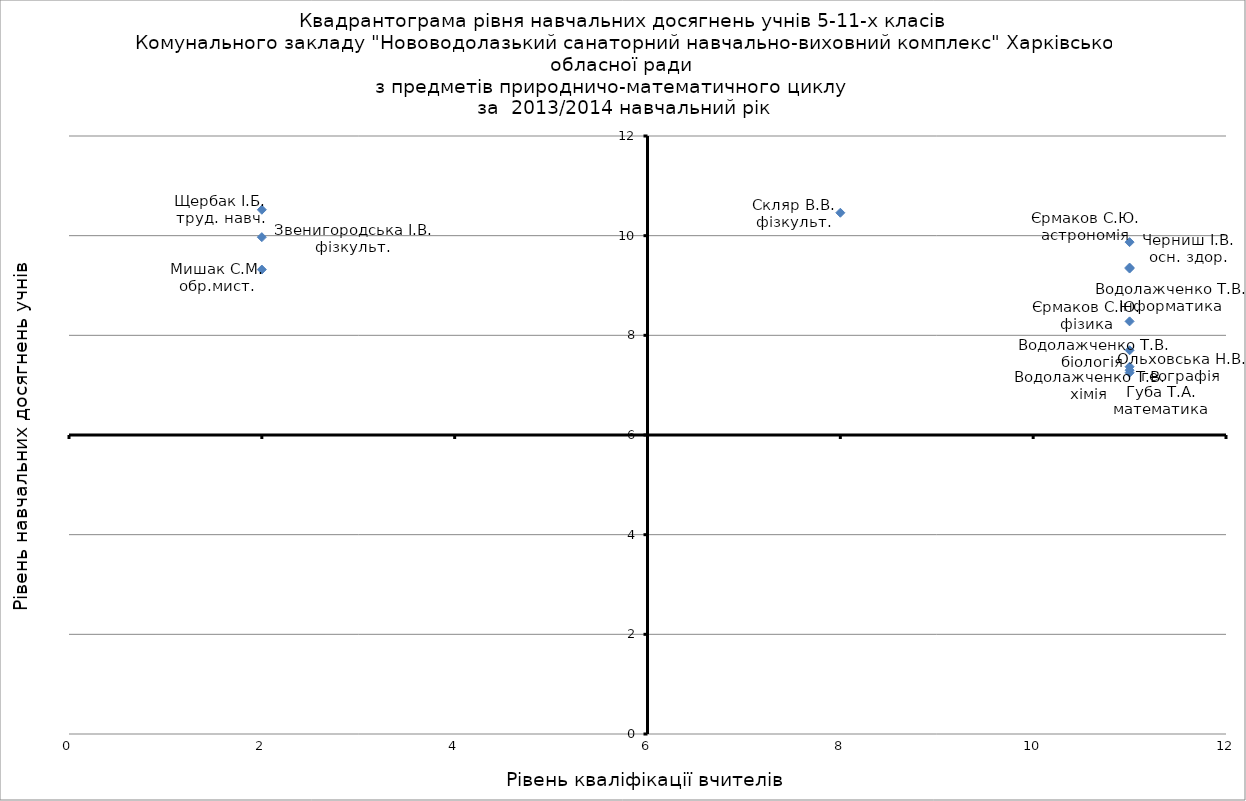
| Category | Series 0 |
|---|---|
| 11.0 | 8.28 |
| 11.0 | 7.25 |
| 11.0 | 7.3 |
| 11.0 | 7.37 |
| 11.0 | 9.36 |
| 8.0 | 10.46 |
| 2.0 | 10.52 |
| 2.0 | 9.32 |
| 11.0 | 7.7 |
| 11.0 | 9.34 |
| 11.0 | 9.87 |
| 2.0 | 9.97 |